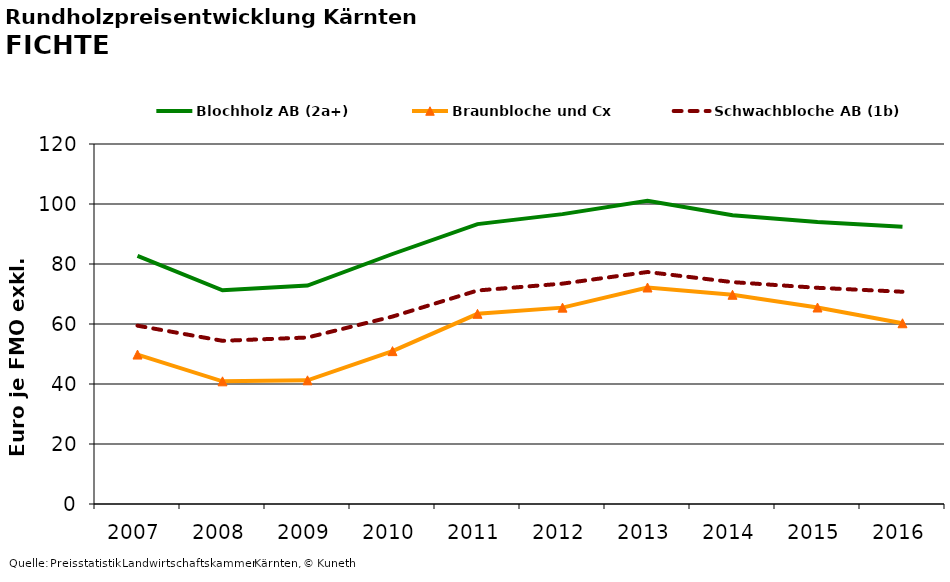
| Category | Blochholz AB (2a+) | Braunbloche und Cx | Schwachbloche AB (1b) |
|---|---|---|---|
| 2007.0 | 82.688 | 49.812 | 59.438 |
| 2008.0 | 71.229 | 40.896 | 54.396 |
| 2009.0 | 72.799 | 41.229 | 55.5 |
| 2010.0 | 83.333 | 50.958 | 62.479 |
| 2011.0 | 93.292 | 63.396 | 71.167 |
| 2012.0 | 96.626 | 65.458 | 73.458 |
| 2013.0 | 101.086 | 72.167 | 77.333 |
| 2014.0 | 96.258 | 69.75 | 73.958 |
| 2015.0 | 94.029 | 65.5 | 72.062 |
| 2016.0 | 92.433 | 60.25 | 70.75 |